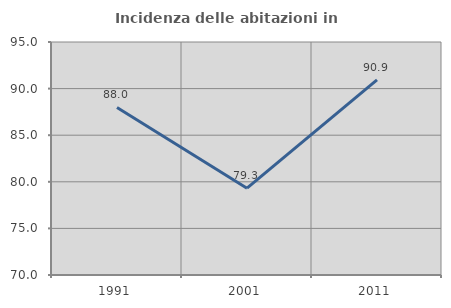
| Category | Incidenza delle abitazioni in proprietà  |
|---|---|
| 1991.0 | 87.982 |
| 2001.0 | 79.318 |
| 2011.0 | 90.944 |